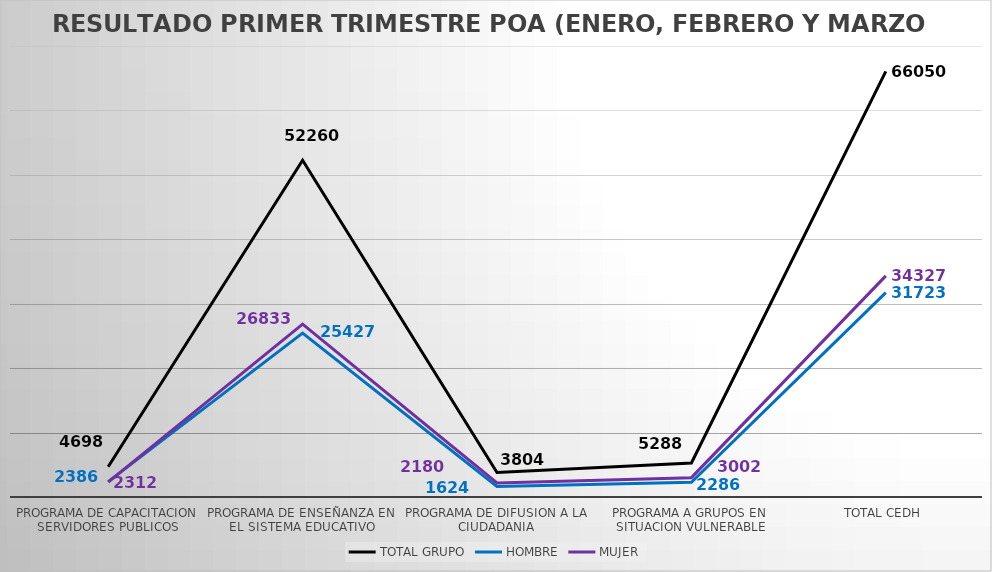
| Category | TOTAL GRUPO | HOMBRE | MUJER |
|---|---|---|---|
| PROGRAMA DE CAPACITACION SERVIDORES PUBLICOS | 4698 | 2386 | 2312 |
| PROGRAMA DE ENSEÑANZA EN EL SISTEMA EDUCATIVO | 52260 | 25427 | 26833 |
| PROGRAMA DE DIFUSION A LA CIUDADANIA | 3804 | 1624 | 2180 |
| PROGRAMA A GRUPOS EN SITUACION VULNERABLE | 5288 | 2286 | 3002 |
| TOTAL CEDH | 66050 | 31723 | 34327 |